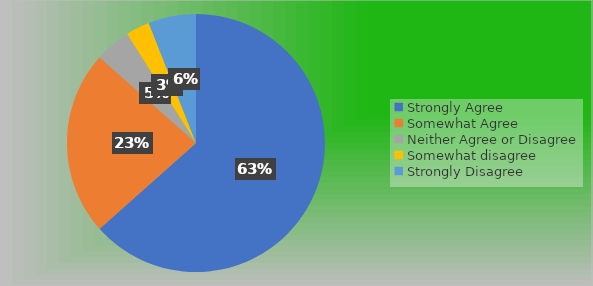
| Category | Series 0 |
|---|---|
| Strongly Agree | 85 |
| Somewhat Agree | 31 |
| Neither Agree or Disagree | 6 |
| Somewhat disagree | 4 |
| Strongly Disagree | 8 |